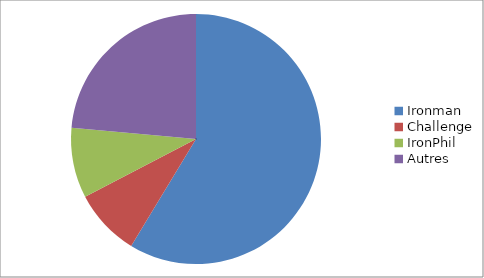
| Category | Series 0 |
|---|---|
| Ironman | 142 |
| Challenge | 21 |
| IronPhil | 22 |
| Autres | 57 |